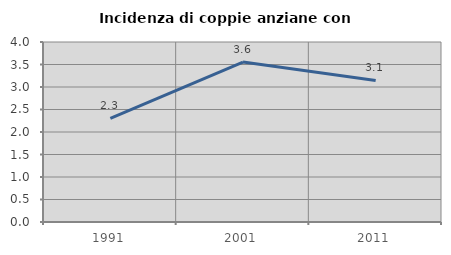
| Category | Incidenza di coppie anziane con figli |
|---|---|
| 1991.0 | 2.303 |
| 2001.0 | 3.554 |
| 2011.0 | 3.146 |